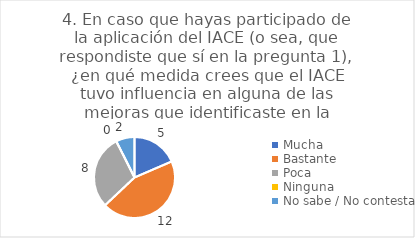
| Category | 4. En caso que hayas participado de la aplicación del IACE (o sea, que respondiste que sí en la pregunta 1), ¿en qué medida crees que el IACE tuvo influencia en alguna de las mejoras que identificaste en la pregunta anterior? |
|---|---|
| Mucha  | 0.185 |
| Bastante  | 0.444 |
| Poca  | 0.296 |
| Ninguna  | 0 |
| No sabe / No contesta | 0.074 |